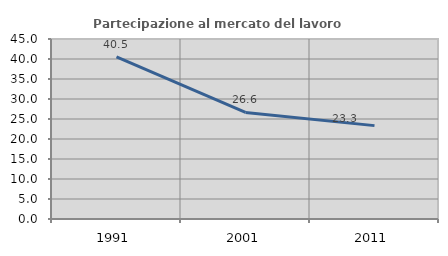
| Category | Partecipazione al mercato del lavoro  femminile |
|---|---|
| 1991.0 | 40.533 |
| 2001.0 | 26.646 |
| 2011.0 | 23.345 |